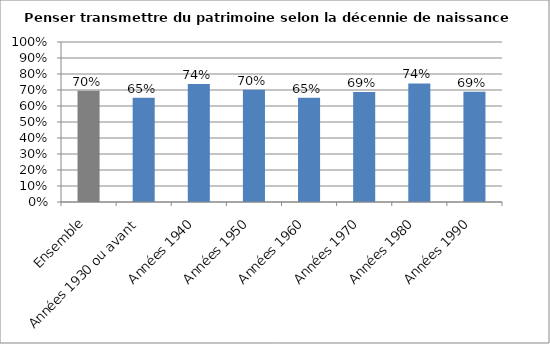
| Category | Penser transmettre du patrimoine selon la décennie de naissance |
|---|---|
| Ensemble | 0.695 |
| Années 1930 ou avant | 0.651 |
| Années 1940 | 0.738 |
| Années 1950 | 0.702 |
| Années 1960 | 0.651 |
| Années 1970 | 0.688 |
| Années 1980 | 0.741 |
| Années 1990 | 0.689 |